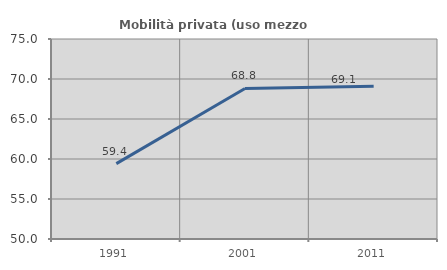
| Category | Mobilità privata (uso mezzo privato) |
|---|---|
| 1991.0 | 59.421 |
| 2001.0 | 68.813 |
| 2011.0 | 69.104 |